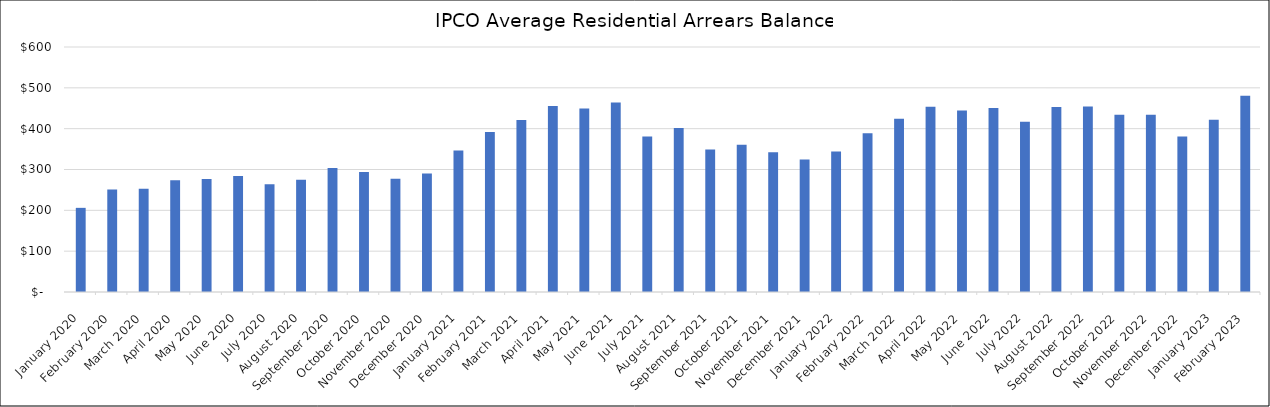
| Category | Average Arrears Balance |
|---|---|
| 2020-01-01 | 206.082 |
| 2020-02-01 | 251.137 |
| 2020-03-01 | 252.964 |
| 2020-04-01 | 273.389 |
| 2020-05-01 | 276.608 |
| 2020-06-01 | 284.227 |
| 2020-07-01 | 264.126 |
| 2020-08-01 | 275.051 |
| 2020-09-01 | 303.583 |
| 2020-10-01 | 294.068 |
| 2020-11-01 | 277.35 |
| 2020-12-01 | 290.313 |
| 2021-01-01 | 346.311 |
| 2021-02-01 | 391.659 |
| 2021-03-01 | 420.926 |
| 2021-04-01 | 455.305 |
| 2021-05-01 | 449.333 |
| 2021-06-01 | 464.173 |
| 2021-07-01 | 380.685 |
| 2021-08-01 | 401.801 |
| 2021-09-01 | 349.239 |
| 2021-10-01 | 360.486 |
| 2021-11-01 | 342.174 |
| 2021-12-01 | 324.701 |
| 2022-01-01 | 343.991 |
| 2022-02-01 | 388.71 |
| 2022-03-01 | 424.221 |
| 2022-04-01 | 453.658 |
| 2022-05-01 | 444.473 |
| 2022-06-01 | 450.917 |
| 2022-07-01 | 417.025 |
| 2022-08-01 | 453.266 |
| 2022-09-01 | 454.407 |
| 2022-10-01 | 434.189 |
| 2022-11-01 | 433.821 |
| 2022-12-01 | 380.999 |
| 2023-01-01 | 421.97 |
| 2023-02-01 | 480.756 |